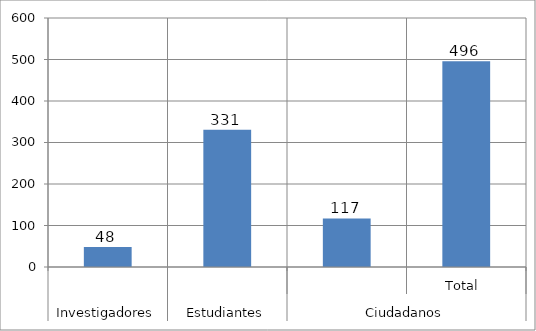
| Category | Series 0 |
|---|---|
| 0 | 48 |
| 1 | 331 |
| 2 | 117 |
| 3 | 496 |